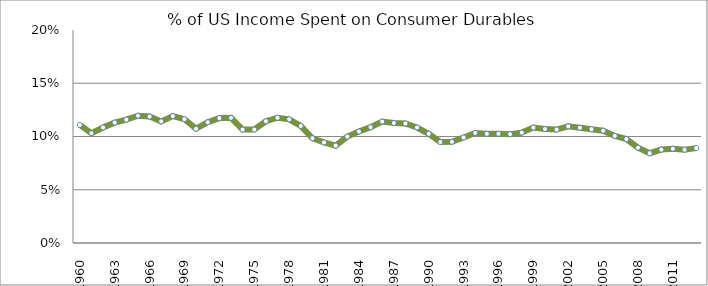
| Category | Series 0 |
|---|---|
| 1960.0 | 0.111 |
| 1961.0 | 0.103 |
| 1962.0 | 0.108 |
| 1963.0 | 0.113 |
| 1964.0 | 0.116 |
| 1965.0 | 0.12 |
| 1966.0 | 0.119 |
| 1967.0 | 0.114 |
| 1968.0 | 0.119 |
| 1969.0 | 0.116 |
| 1970.0 | 0.107 |
| 1971.0 | 0.113 |
| 1972.0 | 0.117 |
| 1973.0 | 0.118 |
| 1974.0 | 0.106 |
| 1975.0 | 0.107 |
| 1976.0 | 0.114 |
| 1977.0 | 0.118 |
| 1978.0 | 0.116 |
| 1979.0 | 0.11 |
| 1980.0 | 0.098 |
| 1981.0 | 0.094 |
| 1982.0 | 0.091 |
| 1983.0 | 0.1 |
| 1984.0 | 0.105 |
| 1985.0 | 0.109 |
| 1986.0 | 0.114 |
| 1987.0 | 0.113 |
| 1988.0 | 0.112 |
| 1989.0 | 0.108 |
| 1990.0 | 0.103 |
| 1991.0 | 0.095 |
| 1992.0 | 0.095 |
| 1993.0 | 0.099 |
| 1994.0 | 0.103 |
| 1995.0 | 0.103 |
| 1996.0 | 0.103 |
| 1997.0 | 0.102 |
| 1998.0 | 0.104 |
| 1999.0 | 0.108 |
| 2000.0 | 0.107 |
| 2001.0 | 0.107 |
| 2002.0 | 0.11 |
| 2003.0 | 0.108 |
| 2004.0 | 0.107 |
| 2005.0 | 0.105 |
| 2006.0 | 0.101 |
| 2007.0 | 0.098 |
| 2008.0 | 0.089 |
| 2009.0 | 0.084 |
| 2010.0 | 0.088 |
| 2011.0 | 0.089 |
| 2012.0 | 0.088 |
| 2013.0 | 0.089 |